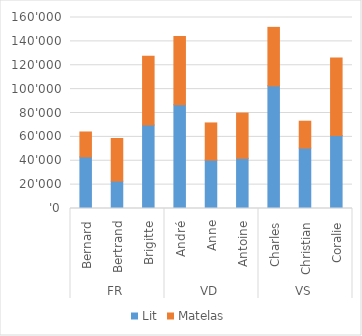
| Category | Lit | Matelas |
|---|---|---|
| 0 | 43200 | 20900 |
| 1 | 22930 | 35730 |
| 2 | 69990 | 57530 |
| 3 | 86920 | 57240 |
| 4 | 40580 | 31085 |
| 5 | 42060 | 37850 |
| 6 | 102740 | 48995 |
| 7 | 50680 | 22440 |
| 8 | 61250 | 64895 |